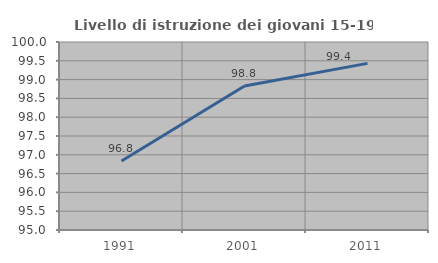
| Category | Livello di istruzione dei giovani 15-19 anni |
|---|---|
| 1991.0 | 96.835 |
| 2001.0 | 98.828 |
| 2011.0 | 99.432 |